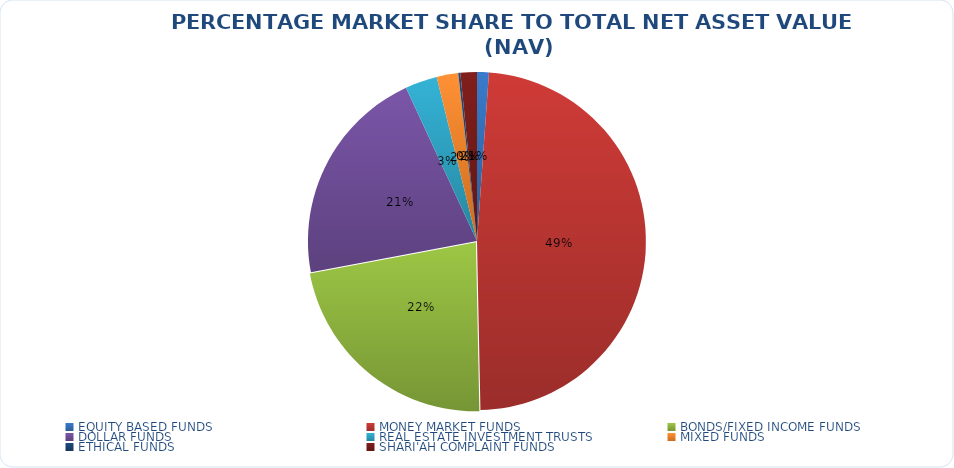
| Category | NET ASSET VALUE |
|---|---|
| EQUITY BASED FUNDS | 17103979411.67 |
| MONEY MARKET FUNDS | 734404198247.478 |
| BONDS/FIXED INCOME FUNDS | 338349672651.756 |
| DOLLAR FUNDS | 318608459435.229 |
| REAL ESTATE INVESTMENT TRUSTS | 46332605433.94 |
| MIXED FUNDS | 31179910941.777 |
| ETHICAL FUNDS | 3064465697.67 |
| SHARI'AH COMPLAINT FUNDS | 23806773999.32 |